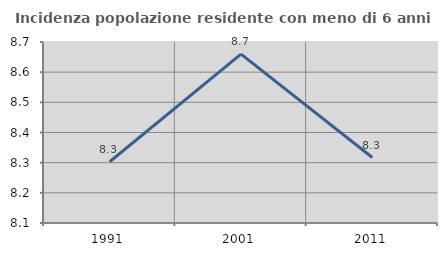
| Category | Incidenza popolazione residente con meno di 6 anni |
|---|---|
| 1991.0 | 8.303 |
| 2001.0 | 8.66 |
| 2011.0 | 8.317 |